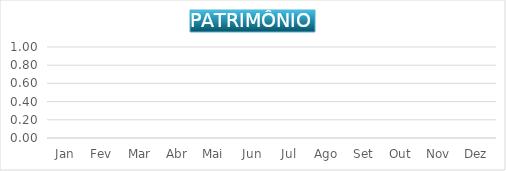
| Category | PATRIMÔNIO |
|---|---|
| Jan | 0 |
| Fev | 0 |
| Mar | 0 |
| Abr | 0 |
| Mai | 0 |
| Jun | 0 |
| Jul | 0 |
| Ago | 0 |
| Set | 0 |
| Out | 0 |
| Nov | 0 |
| Dez | 0 |